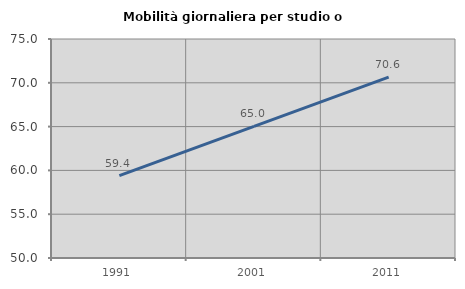
| Category | Mobilità giornaliera per studio o lavoro |
|---|---|
| 1991.0 | 59.394 |
| 2001.0 | 65.028 |
| 2011.0 | 70.646 |